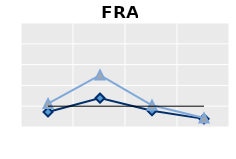
| Category | Public goods | Individual items only | Series 1 |
|---|---|---|---|
| 25-54 | 0.721 | 1.124 | 1 |
| 55-64 | 1.387 | 2.496 | 1 |
| 65+ | 0.785 | 1.042 | 1 |